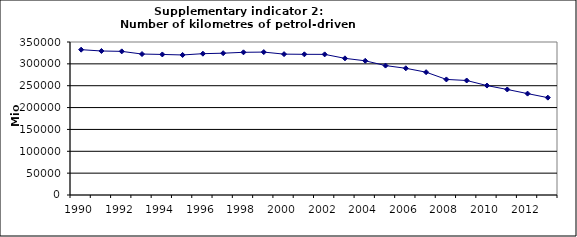
| Category | Number of kilometres of petrol-driven passenger cars, Mio km |
|---|---|
| 1990 | 332471.069 |
| 1991 | 329422.898 |
| 1992 | 328579.664 |
| 1993 | 322466.879 |
| 1994 | 321532.074 |
| 1995 | 320341.376 |
| 1996 | 323279.298 |
| 1997 | 324390.675 |
| 1998 | 326435.248 |
| 1999 | 326924.554 |
| 2000 | 322257.733 |
| 2001 | 321827.529 |
| 2002 | 321720.46 |
| 2003 | 312646.746 |
| 2004 | 306990.437 |
| 2005 | 296055.649 |
| 2006 | 289874.392 |
| 2007 | 280945.855 |
| 2008 | 264367.997 |
| 2009 | 261939.912 |
| 2010 | 250324.52 |
| 2011 | 241393.466 |
| 2012 | 231907.664 |
| 2013 | 222711.788 |